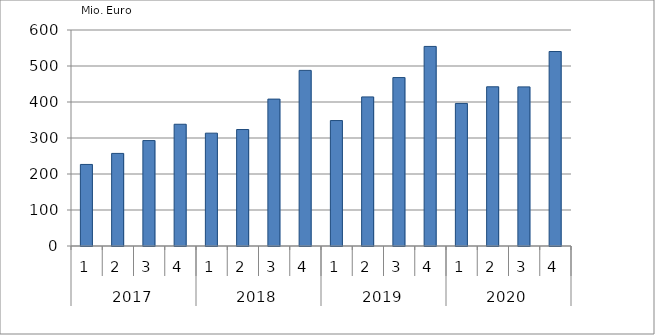
| Category | Ausbaugewerblicher Umsatz3 |
|---|---|
| 0 | 226552.317 |
| 1 | 257191.13 |
| 2 | 292853.372 |
| 3 | 338154.691 |
| 4 | 313433.569 |
| 5 | 323547.694 |
| 6 | 408057.42 |
| 7 | 487843.765 |
| 8 | 348466.115 |
| 9 | 414145.554 |
| 10 | 467849.207 |
| 11 | 554369.34 |
| 12 | 395996.128 |
| 13 | 442270.528 |
| 14 | 441987.109 |
| 15 | 540250.513 |